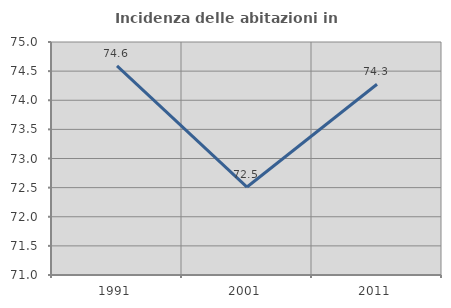
| Category | Incidenza delle abitazioni in proprietà  |
|---|---|
| 1991.0 | 74.59 |
| 2001.0 | 72.51 |
| 2011.0 | 74.275 |